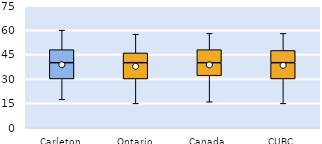
| Category | 25th | 50th | 75th |
|---|---|---|---|
| Carleton | 30 | 10 | 8 |
| Ontario | 30 | 10 | 6 |
| Canada | 32 | 8 | 8 |
| CUBC | 30 | 10 | 7.5 |